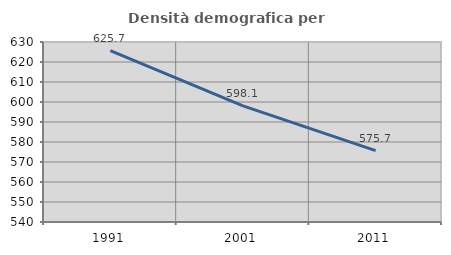
| Category | Densità demografica |
|---|---|
| 1991.0 | 625.675 |
| 2001.0 | 598.051 |
| 2011.0 | 575.673 |